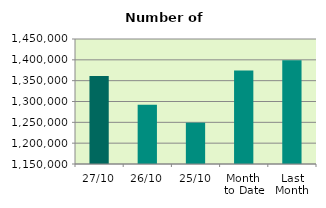
| Category | Series 0 |
|---|---|
| 27/10 | 1360946 |
| 26/10 | 1292030 |
| 25/10 | 1249246 |
| Month 
to Date | 1374663.789 |
| Last
Month | 1399299.909 |